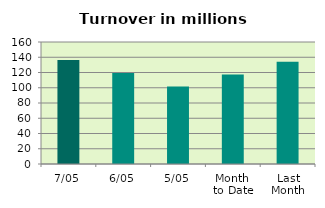
| Category | Series 0 |
|---|---|
| 7/05 | 136.498 |
| 6/05 | 119.211 |
| 5/05 | 101.777 |
| Month 
to Date | 117.537 |
| Last
Month | 133.981 |